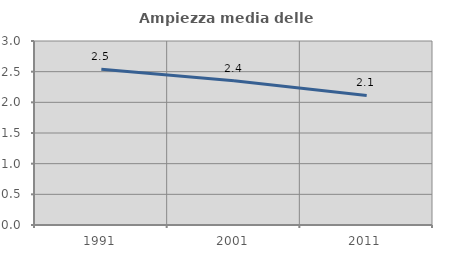
| Category | Ampiezza media delle famiglie |
|---|---|
| 1991.0 | 2.54 |
| 2001.0 | 2.351 |
| 2011.0 | 2.112 |